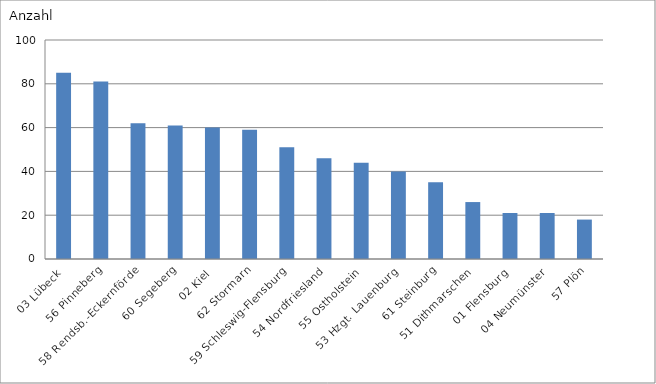
| Category | 03 Lübeck |
|---|---|
| 03 Lübeck | 85 |
| 56 Pinneberg | 81 |
| 58 Rendsb.-Eckernförde | 62 |
| 60 Segeberg | 61 |
| 02 Kiel | 60 |
| 62 Stormarn | 59 |
| 59 Schleswig-Flensburg | 51 |
| 54 Nordfriesland | 46 |
| 55 Ostholstein | 44 |
| 53 Hzgt. Lauenburg | 40 |
| 61 Steinburg | 35 |
| 51 Dithmarschen | 26 |
| 01 Flensburg | 21 |
| 04 Neumünster | 21 |
| 57 Plön | 18 |